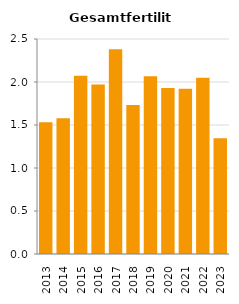
| Category | Gesamtfertilität |
|---|---|
| 2013.0 | 1.532 |
| 2014.0 | 1.579 |
| 2015.0 | 2.072 |
| 2016.0 | 1.97 |
| 2017.0 | 2.38 |
| 2018.0 | 1.734 |
| 2019.0 | 2.068 |
| 2020.0 | 1.93 |
| 2021.0 | 1.923 |
| 2022.0 | 2.05 |
| 2023.0 | 1.347 |